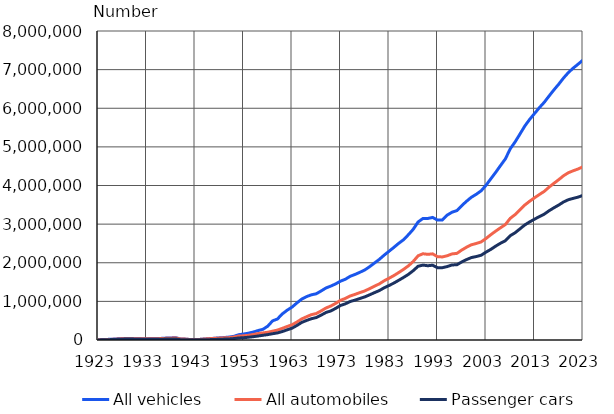
| Category | All vehicles | All automobiles | Passenger cars |
|---|---|---|---|
| 1923.0 | 5965 | 3576 | 2336 |
| 1924.0 | 10053 | 6678 | 4200 |
| 1925.0 | 15645 | 11921 | 7641 |
| 1926.0 | 21351 | 17230 | 11813 |
| 1927.0 | 28666 | 24376 | 16905 |
| 1928.0 | 37095 | 32190 | 22079 |
| 1929.0 | 40273 | 35030 | 23592 |
| 1930.0 | 40015 | 34781 | 22888 |
| 1931.0 | 38685 | 33959 | 22064 |
| 1932.0 | 35450 | 30843 | 19857 |
| 1933.0 | 34723 | 30167 | 18661 |
| 1934.0 | 36917 | 32101 | 19119 |
| 1935.0 | 38752 | 33811 | 19905 |
| 1936.0 | 41675 | 36558 | 20835 |
| 1937.0 | 48925 | 43299 | 23985 |
| 1938.0 | 53418 | 47226 | 26179 |
| 1939.0 | 59249 | 51771 | 29002 |
| 1940.0 | 28051 | 27161 | 8824 |
| 1941.0 | 23048 | 22808 | 5662 |
| 1942.0 | 12533 | 12438 | 3598 |
| 1943.0 | 14660 | 14560 | 4086 |
| 1944.0 | 15434 | 15363 | 4028 |
| 1945.0 | 26733 | 26310 | 6230 |
| 1946.0 | 35876 | 34489 | 9278 |
| 1947.0 | 44970 | 42270 | 13748 |
| 1948.0 | 54884 | 49135 | 18640 |
| 1949.0 | 64056 | 56193 | 23167 |
| 1950.0 | 75447 | 61256 | 26814 |
| 1951.0 | 94814 | 76206 | 36231 |
| 1952.0 | 136184 | 101252 | 52619 |
| 1953.0 | 155132 | 108270 | 59216 |
| 1954.0 | 176122 | 120687 | 70795 |
| 1955.0 | 205519 | 141576 | 85448 |
| 1956.0 | 244041 | 167078 | 102961 |
| 1957.0 | 276659 | 183813 | 122075 |
| 1958.0 | 357744 | 200088 | 139704 |
| 1959.0 | 495720 | 228918 | 162968 |
| 1960.0 | 543597 | 256892 | 183409 |
| 1961.0 | 675347 | 301586 | 219148 |
| 1962.0 | 771197 | 349888 | 263033 |
| 1963.0 | 851133 | 393920 | 305444 |
| 1964.0 | 958854 | 464255 | 375829 |
| 1965.0 | 1057604 | 544856 | 454854 |
| 1966.0 | 1123515 | 602092 | 505926 |
| 1967.0 | 1169569 | 655757 | 551198 |
| 1968.0 | 1196985 | 685475 | 580747 |
| 1969.0 | 1268791 | 752696 | 643057 |
| 1970.0 | 1346645 | 828010 | 711968 |
| 1971.0 | 1395445 | 880056 | 752915 |
| 1972.0 | 1452715 | 947906 | 818044 |
| 1973.0 | 1522975 | 1028120 | 894104 |
| 1974.0 | 1572635 | 1076208 | 936681 |
| 1975.0 | 1649574 | 1139967 | 996284 |
| 1976.0 | 1697337 | 1181473 | 1032884 |
| 1977.0 | 1753163 | 1227646 | 1075399 |
| 1978.0 | 1813293 | 1270802 | 1115265 |
| 1979.0 | 1897640 | 1329558 | 1169501 |
| 1980.0 | 1991908 | 1392827 | 1225931 |
| 1981.0 | 2086549 | 1452631 | 1279192 |
| 1982.0 | 2197052 | 1532697 | 1352055 |
| 1983.0 | 2296279 | 1597956 | 1410438 |
| 1984.0 | 2397519 | 1667987 | 1473975 |
| 1985.0 | 2502803 | 1746615 | 1546094 |
| 1986.0 | 2596454 | 1828949 | 1619848 |
| 1987.0 | 2725880 | 1919719 | 1698671 |
| 1988.0 | 2866693 | 2034166 | 1795908 |
| 1989.0 | 3055555 | 2180532 | 1908971 |
| 1990.0 | 3146308 | 2233059 | 1938856 |
| 1991.0 | 3146228 | 2218067 | 1922541 |
| 1992.0 | 3173342 | 2230516 | 1936345 |
| 1993.0 | 3104416 | 2156009 | 1872933 |
| 1994.0 | 3108601 | 2150950 | 1872588 |
| 1995.0 | 3233129 | 2181239 | 1900855 |
| 1996.0 | 3308188 | 2229222 | 1942752 |
| 1997.0 | 3351189 | 2242318 | 1948126 |
| 1998.0 | 3478462 | 2328990 | 2021116 |
| 1999.0 | 3593512 | 2403327 | 2082580 |
| 2000.0 | 3697037 | 2465822 | 2134728 |
| 2001.0 | 3773373 | 2499154 | 2160603 |
| 2002.0 | 3863152 | 2539953 | 2194683 |
| 2003.0 | 4004323 | 2626999 | 2274577 |
| 2004.0 | 4174287 | 2727160 | 2346726 |
| 2005.0 | 4341229 | 2818965 | 2430345 |
| 2006.0 | 4517669 | 2906415 | 2505543 |
| 2007.0 | 4689452 | 2989881 | 2570356 |
| 2008.0 | 4950760 | 3150296 | 2700492 |
| 2009.0 | 5128067 | 3246414 | 2776664 |
| 2010.0 | 5331582 | 3368188 | 2877484 |
| 2011.0 | 5539322 | 3494357 | 2978729 |
| 2012.0 | 5711264 | 3592718 | 3057484 |
| 2013.0 | 5862216 | 3681137 | 3127399 |
| 2014.0 | 6014610 | 3766018 | 3194950 |
| 2015.0 | 6152680 | 3847045 | 3257581 |
| 2016.0 | 6316531 | 3957153 | 3346005 |
| 2017.0 | 6474783 | 4056725 | 3422792 |
| 2018.0 | 6623990 | 4151275 | 3494836 |
| 2019.0 | 6785012 | 4253776 | 3574570 |
| 2020.0 | 6926137 | 4331699 | 3632851 |
| 2021.0 | 7040869 | 4382322 | 3667164 |
| 2022.0 | 7142503 | 4428076 | 3699634 |
| 2023.0 | 7247926 | 4485152 | 3744469 |